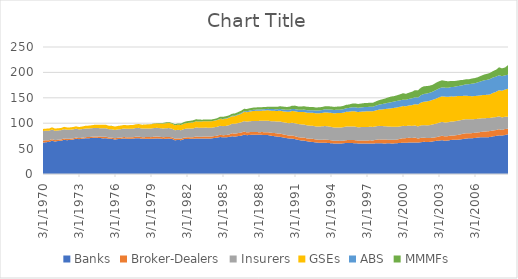
| Category | Banks | Broker-Dealers | Insurers | GSEs | ABS | MMMFs |
|---|---|---|---|---|---|---|
| 3/1/70 | 61.953 | 3.988 | 18.765 | 4.034 | 0 | 0 |
| 6/1/70 | 62.482 | 3.991 | 18.685 | 4.142 | 0 | 0 |
| 9/1/70 | 63.242 | 3.245 | 18.662 | 4.239 | 0 | 0 |
| 12/1/70 | 65.591 | 3.125 | 18.826 | 4.459 | 0 | 0 |
| 3/1/71 | 63.928 | 2.705 | 18.353 | 4.453 | 0 | 0 |
| 6/1/71 | 65.023 | 2.542 | 18.233 | 4.297 | 0 | 0 |
| 9/1/71 | 65.417 | 2.548 | 18.182 | 4.353 | 0 | 0 |
| 12/1/71 | 67.359 | 2.707 | 18.215 | 4.567 | 0 | 0 |
| 3/1/72 | 66.582 | 2.6 | 17.926 | 4.582 | 0 | 0 |
| 6/1/72 | 67.02 | 2.511 | 17.614 | 4.581 | 0 | 0 |
| 9/1/72 | 67.835 | 2.321 | 17.613 | 4.647 | 0 | 0 |
| 12/1/72 | 69.367 | 2.443 | 17.327 | 4.756 | 0 | 0 |
| 3/1/73 | 68.602 | 2.042 | 17.063 | 4.787 | 0 | 0 |
| 6/1/73 | 69.4 | 2.093 | 16.835 | 5.068 | 0 | 0 |
| 9/1/73 | 70.21 | 2.182 | 16.904 | 5.426 | 0 | 0 |
| 12/1/73 | 70.381 | 2.485 | 16.669 | 5.571 | 0 | 0 |
| 3/1/74 | 70.783 | 2.35 | 16.861 | 5.756 | 0 | 0.013 |
| 6/1/74 | 71.43 | 2.545 | 16.661 | 6.032 | 0 | 0.023 |
| 9/1/74 | 71.187 | 2.762 | 16.613 | 6.413 | 0 | 0.038 |
| 12/1/74 | 70.967 | 2.753 | 16.474 | 6.66 | 0 | 0.047 |
| 3/1/75 | 70.061 | 3.197 | 16.694 | 6.86 | 0 | 0.08 |
| 6/1/75 | 70.47 | 2.889 | 16.599 | 6.786 | 0 | 0.065 |
| 9/1/75 | 69.235 | 2.473 | 16.423 | 6.667 | 0 | 0.078 |
| 12/1/75 | 69.173 | 2.456 | 16.329 | 6.701 | 0 | 0.082 |
| 3/1/76 | 67.821 | 2.514 | 16.339 | 6.67 | 0 | 0.105 |
| 6/1/76 | 68.8 | 2.562 | 16.44 | 6.764 | 0 | 0.09 |
| 9/1/76 | 69.114 | 2.62 | 16.667 | 6.924 | 0 | 0.092 |
| 12/1/76 | 70.116 | 2.73 | 16.742 | 6.976 | 0 | 0.108 |
| 3/1/77 | 69.404 | 2.656 | 16.855 | 7.025 | 0 | 0.094 |
| 6/1/77 | 69.456 | 2.928 | 16.836 | 7.025 | 0 | 0.084 |
| 9/1/77 | 69.602 | 2.768 | 16.892 | 7.094 | 0 | 0.079 |
| 12/1/77 | 70.522 | 3.047 | 17.04 | 7.294 | 0 | 0.09 |
| 3/1/78 | 70.526 | 2.991 | 17.342 | 7.434 | 0 | 0.119 |
| 6/1/78 | 69.309 | 3.199 | 16.85 | 7.52 | 0 | 0.153 |
| 9/1/78 | 69.486 | 3.094 | 16.997 | 7.759 | 0 | 0.169 |
| 12/1/78 | 69.55 | 3.224 | 16.886 | 7.996 | 0 | 0.207 |
| 3/1/79 | 69.218 | 3.322 | 17.104 | 8.234 | 0 | 0.391 |
| 6/1/79 | 69.655 | 3.714 | 17.08 | 8.573 | 0 | 0.559 |
| 9/1/79 | 70.143 | 3.664 | 17.077 | 8.817 | 0 | 0.666 |
| 12/1/79 | 70.01 | 3.213 | 17.051 | 9.26 | 0 | 0.913 |
| 3/1/80 | 68.987 | 3.482 | 17.127 | 9.589 | 0 | 1.349 |
| 6/1/80 | 69.357 | 3.33 | 17.432 | 9.83 | 0 | 1.762 |
| 9/1/80 | 69.761 | 3.19 | 17.47 | 9.988 | 0 | 1.677 |
| 12/1/80 | 69.063 | 3.141 | 16.991 | 9.97 | 0 | 1.405 |
| 3/1/81 | 66.32 | 3.144 | 16.68 | 9.712 | 0 | 2.237 |
| 6/1/81 | 67.116 | 3.092 | 16.823 | 10.123 | 0 | 2.39 |
| 9/1/81 | 66.423 | 2.943 | 16.697 | 10.369 | 0 | 2.957 |
| 12/1/81 | 68.629 | 3.111 | 16.805 | 10.558 | 0 | 3.274 |
| 3/1/82 | 69.04 | 3.148 | 17.265 | 10.951 | 0 | 3.569 |
| 6/1/82 | 69.165 | 3.241 | 17.291 | 11.3 | 0 | 3.687 |
| 9/1/82 | 69.173 | 3.063 | 17.451 | 11.773 | 0 | 4.171 |
| 12/1/82 | 70.11 | 3.804 | 17.691 | 12.097 | 0 | 4.036 |
| 3/1/83 | 69.712 | 3.624 | 17.779 | 12.244 | 0 | 3.848 |
| 6/1/83 | 69.859 | 3.641 | 17.612 | 12.405 | 0 | 3.417 |
| 9/1/83 | 70.077 | 3.735 | 17.5 | 12.59 | 0.048 | 3.25 |
| 12/1/83 | 69.891 | 3.957 | 17.422 | 12.677 | 0.079 | 3.153 |
| 3/1/84 | 70.017 | 3.557 | 17.32 | 12.682 | 0.121 | 3.382 |
| 6/1/84 | 70.779 | 3.819 | 17.317 | 12.847 | 0.162 | 3.349 |
| 9/1/84 | 71.563 | 3.841 | 17.472 | 13.241 | 0.202 | 3.439 |
| 12/1/84 | 72.766 | 4.441 | 17.651 | 13.379 | 0.477 | 3.98 |
| 3/1/85 | 72.291 | 4.08 | 17.794 | 13.609 | 0.57 | 4.142 |
| 6/1/85 | 72.397 | 4.272 | 18.085 | 14.023 | 0.645 | 4.392 |
| 9/1/85 | 72.804 | 4.833 | 18.359 | 14.487 | 0.708 | 4.178 |
| 12/1/85 | 74.347 | 5.86 | 18.828 | 14.795 | 0.78 | 4.023 |
| 3/1/86 | 73.591 | 5.892 | 19.255 | 15.138 | 0.953 | 4.46 |
| 6/1/86 | 74.62 | 5.917 | 19.734 | 15.961 | 1.106 | 4.478 |
| 9/1/86 | 75.403 | 6.029 | 20.196 | 16.79 | 1.223 | 4.768 |
| 12/1/86 | 77.417 | 5.986 | 20.754 | 17.971 | 1.53 | 4.586 |
| 3/1/87 | 76.397 | 5.588 | 21.12 | 18.56 | 1.89 | 4.572 |
| 6/1/87 | 76.924 | 5.599 | 21.375 | 19.107 | 2.075 | 4.381 |
| 9/1/87 | 77.397 | 5.215 | 21.779 | 19.629 | 2.276 | 4.325 |
| 12/1/87 | 77.387 | 5.288 | 21.856 | 19.916 | 2.254 | 4.308 |
| 3/1/88 | 77.024 | 5.281 | 22.263 | 19.895 | 2.454 | 4.652 |
| 6/1/88 | 77.033 | 5.448 | 22.387 | 19.877 | 2.556 | 4.312 |
| 9/1/88 | 76.771 | 5.541 | 22.606 | 20.174 | 2.631 | 4.111 |
| 12/1/88 | 76.668 | 5.56 | 22.783 | 20.497 | 2.727 | 4.21 |
| 3/1/89 | 75.308 | 5.721 | 22.883 | 20.741 | 3.384 | 4.477 |
| 6/1/89 | 74.542 | 6.32 | 23.103 | 20.463 | 3.336 | 4.62 |
| 9/1/89 | 73.687 | 6.266 | 23.257 | 20.769 | 3.314 | 4.863 |
| 12/1/89 | 73.131 | 6.621 | 23.665 | 21.332 | 3.489 | 5.16 |
| 3/1/90 | 71.978 | 6.086 | 23.821 | 21.505 | 3.561 | 5.782 |
| 6/1/90 | 70.859 | 5.973 | 24.158 | 21.842 | 3.731 | 5.519 |
| 9/1/90 | 70.013 | 5.48 | 24.459 | 22.407 | 3.881 | 5.927 |
| 12/1/90 | 69.712 | 6.306 | 24.881 | 23.139 | 4.155 | 6.265 |
| 3/1/91 | 68.686 | 5.709 | 25.45 | 23.601 | 4.295 | 6.881 |
| 6/1/91 | 67.267 | 5.409 | 25.815 | 23.748 | 4.437 | 6.435 |
| 9/1/91 | 66.104 | 5.677 | 25.935 | 24.179 | 4.638 | 6.344 |
| 12/1/91 | 65.854 | 5.902 | 25.688 | 24.61 | 4.769 | 6.517 |
| 3/1/92 | 64.43 | 5.587 | 25.766 | 24.929 | 4.934 | 6.741 |
| 6/1/92 | 63.442 | 6.035 | 25.74 | 25.253 | 5.045 | 6.46 |
| 9/1/92 | 62.946 | 6.184 | 25.719 | 25.528 | 5.204 | 6.33 |
| 12/1/92 | 62.124 | 5.832 | 25.606 | 25.833 | 5.344 | 6.171 |
| 3/1/93 | 61.548 | 5.914 | 26.051 | 26.099 | 5.531 | 6.15 |
| 6/1/93 | 61.499 | 6.03 | 26.339 | 26.287 | 5.688 | 6.072 |
| 9/1/93 | 61.467 | 6.335 | 26.617 | 26.945 | 5.951 | 6.007 |
| 12/1/93 | 61.145 | 6.201 | 26.429 | 27.065 | 6.225 | 6.157 |
| 3/1/94 | 60.594 | 5.82 | 26.428 | 27.583 | 6.468 | 6.148 |
| 6/1/94 | 60.113 | 5.333 | 26.135 | 27.875 | 6.53 | 6.035 |
| 9/1/94 | 60.178 | 5.24 | 26.236 | 28.285 | 6.641 | 6.054 |
| 12/1/94 | 59.954 | 5.204 | 26.122 | 28.627 | 6.7 | 6.243 |
| 3/1/95 | 60.394 | 5.182 | 26.452 | 28.553 | 6.786 | 6.47 |
| 6/1/95 | 61.093 | 5.522 | 26.78 | 28.919 | 7.032 | 6.783 |
| 9/1/95 | 61.248 | 5.591 | 26.748 | 29.087 | 7.45 | 6.663 |
| 12/1/95 | 60.886 | 6.063 | 26.676 | 29.919 | 7.846 | 7.097 |
| 3/1/96 | 60.603 | 6.044 | 26.613 | 30.056 | 8.067 | 7.647 |
| 6/1/96 | 60.206 | 5.681 | 26.098 | 30.037 | 8.295 | 7.488 |
| 9/1/96 | 60.26 | 5.853 | 26.221 | 30.372 | 8.408 | 7.587 |
| 12/1/96 | 60.082 | 5.869 | 26.492 | 30.717 | 8.594 | 7.776 |
| 3/1/97 | 60.091 | 6.053 | 26.474 | 30.772 | 8.536 | 7.992 |
| 6/1/97 | 60.198 | 6.027 | 26.633 | 30.874 | 8.6 | 7.8 |
| 9/1/97 | 59.827 | 6.283 | 26.613 | 30.893 | 8.785 | 7.924 |
| 12/1/97 | 60.497 | 6.861 | 26.503 | 31.411 | 9.405 | 8.332 |
| 3/1/98 | 60.465 | 7.73 | 26.579 | 31.959 | 9.78 | 8.836 |
| 6/1/98 | 60.389 | 7.56 | 26.455 | 32.744 | 10.508 | 9.209 |
| 9/1/98 | 60.007 | 7.785 | 26.228 | 33.852 | 10.969 | 9.679 |
| 12/1/98 | 60.683 | 6.909 | 25.946 | 35.069 | 11.568 | 10.586 |
| 3/1/99 | 60.183 | 7.25 | 25.714 | 36.109 | 11.983 | 11.145 |
| 6/1/99 | 60.24 | 7.222 | 25.465 | 37.196 | 12.49 | 10.686 |
| 9/1/99 | 60.672 | 7.084 | 25.026 | 38.276 | 12.807 | 11.066 |
| 12/1/99 | 61.151 | 8.174 | 24.366 | 38.609 | 12.627 | 11.887 |
| 3/1/00 | 61.477 | 9.033 | 24.314 | 38.889 | 12.728 | 12.581 |
| 6/1/00 | 61.389 | 9.239 | 23.833 | 38.91 | 12.68 | 11.814 |
| 9/1/00 | 61.976 | 9.401 | 23.901 | 39.765 | 12.907 | 12.167 |
| 12/1/00 | 62.183 | 8.694 | 23.74 | 40.943 | 13.499 | 12.878 |
| 3/1/01 | 62.151 | 9.587 | 23.82 | 41.912 | 13.588 | 14.016 |
| 6/1/01 | 61.871 | 7.899 | 23.892 | 43.086 | 13.851 | 13.974 |
| 9/1/01 | 62.594 | 8.677 | 24.454 | 45.027 | 14.448 | 14.952 |
| 12/1/01 | 63.409 | 8.23 | 24.595 | 46.077 | 15.294 | 15.18 |
| 3/1/02 | 62.9 | 7.726 | 25.023 | 47.252 | 15.507 | 14.701 |
| 6/1/02 | 63.321 | 7.518 | 25.461 | 47.975 | 15.895 | 13.893 |
| 9/1/02 | 64.196 | 7.504 | 26.048 | 48.422 | 16.171 | 13.647 |
| 12/1/02 | 65.203 | 7.093 | 26.653 | 49.367 | 16.928 | 14.38 |
| 3/1/03 | 65.694 | 8.195 | 27.028 | 50.046 | 17.428 | 14.051 |
| 6/1/03 | 66.61 | 8.638 | 27.402 | 50.237 | 17.682 | 13.914 |
| 9/1/03 | 65.394 | 8.677 | 27.3 | 50.966 | 17.665 | 13.381 |
| 12/1/03 | 65.954 | 8.623 | 27.317 | 49.991 | 17.772 | 12.829 |
| 3/1/04 | 67.033 | 8.696 | 27.664 | 49.447 | 18.24 | 12.05 |
| 6/1/04 | 67.531 | 8.293 | 27.746 | 49.152 | 18.816 | 11.33 |
| 9/1/04 | 67.417 | 9.282 | 27.955 | 48.652 | 19.536 | 10.899 |
| 12/1/04 | 67.971 | 9.792 | 27.975 | 47.739 | 20.36 | 10.893 |
| 3/1/05 | 68.891 | 10.331 | 27.858 | 46.707 | 21.21 | 10.285 |
| 6/1/05 | 69.783 | 10.402 | 27.654 | 46.391 | 22.368 | 9.836 |
| 9/1/05 | 70.336 | 9.952 | 27.501 | 45.714 | 23.315 | 9.651 |
| 12/1/05 | 70.478 | 9.992 | 27.137 | 45.528 | 24.643 | 10.232 |
| 3/1/06 | 70.783 | 10.435 | 26.943 | 45.276 | 25.307 | 10.132 |
| 6/1/06 | 71.975 | 9.916 | 26.802 | 45.53 | 26.313 | 10.183 |
| 9/1/06 | 72.221 | 10.532 | 26.696 | 45.639 | 27.449 | 10.753 |
| 12/1/06 | 72.467 | 11.226 | 26.201 | 45.724 | 28.742 | 11.35 |
| 3/1/07 | 72.185 | 11.771 | 26.085 | 45.772 | 29.515 | 11.83 |
| 6/1/07 | 72.807 | 11.755 | 25.865 | 46.279 | 30.229 | 12.107 |
| 9/1/07 | 74.075 | 11.591 | 25.795 | 48.124 | 30.378 | 12.688 |
| 12/1/07 | 74.949 | 11.531 | 25.594 | 49.668 | 29.923 | 13.569 |
| 3/1/08 | 76.078 | 12.179 | 25.325 | 51.253 | 29.531 | 15.641 |
| 6/1/08 | 75.704 | 10.975 | 24.698 | 52.499 | 28.664 | 15.442 |
| 9/1/08 | 76.712 | 11.946 | 24.036 | 53.513 | 27.987 | 15.408 |
| 12/1/08 | 78.273 | 10.716 | 23.942 | 54.975 | 27.591 | 18.834 |